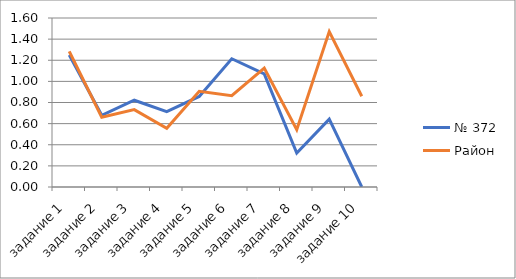
| Category | № 372 | Район |
|---|---|---|
| задание 1 | 1.25 | 1.284 |
| задание 2 | 0.679 | 0.661 |
| задание 3 | 0.821 | 0.733 |
| задание 4 | 0.714 | 0.555 |
| задание 5 | 0.857 | 0.906 |
| задание 6 | 1.214 | 0.865 |
| задание 7 | 1.071 | 1.127 |
| задание 8 | 0.321 | 0.543 |
| задание 9 | 0.643 | 1.472 |
| задание 10 | 0 | 0.859 |